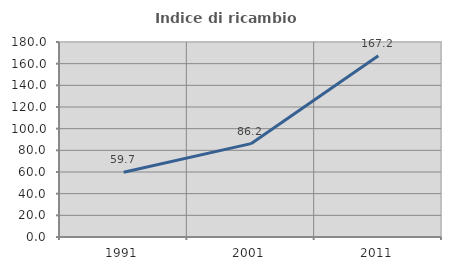
| Category | Indice di ricambio occupazionale  |
|---|---|
| 1991.0 | 59.698 |
| 2001.0 | 86.164 |
| 2011.0 | 167.244 |